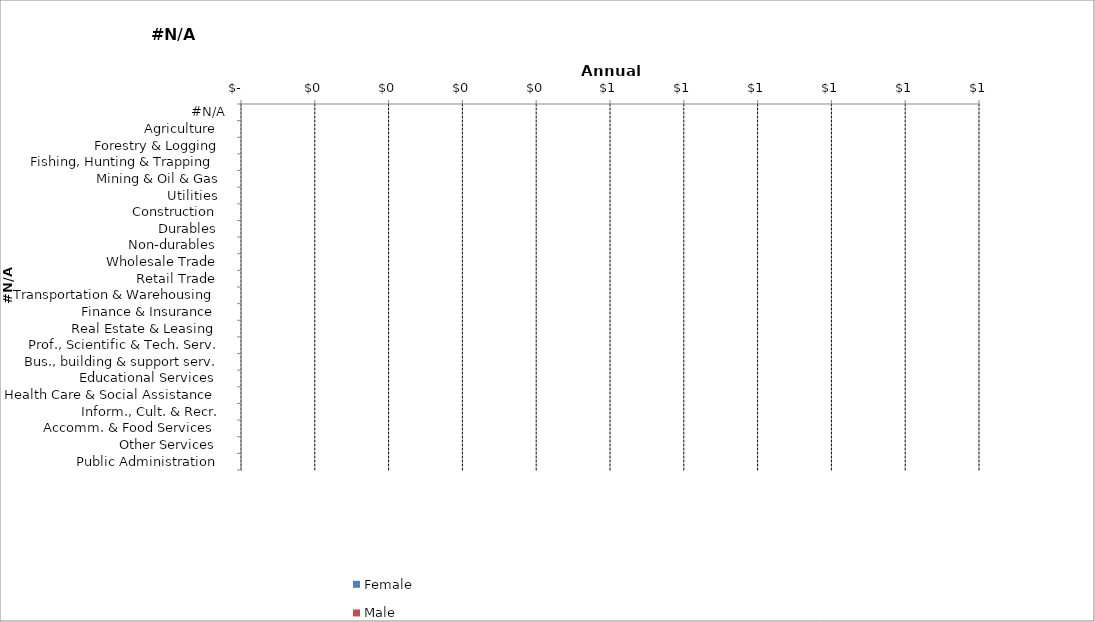
| Category | Female | Male | Ratio |
|---|---|---|---|
|  #N/A  | 0 | 0 | 0 |
|  Agriculture   | 0 | 0 | 0 |
|  Forestry & Logging  | 0 | 0 | 0 |
|  Fishing, Hunting & Trapping   | 0 | 0 | 0 |
|  Mining & Oil & Gas  | 0 | 0 | 0 |
|  Utilities   | 0 | 0 | 0 |
|  Construction   | 0 | 0 | 0 |
|  Durables   | 0 | 0 | 0 |
|  Non-durables   | 0 | 0 | 0 |
|  Wholesale Trade   | 0 | 0 | 0 |
|  Retail Trade   | 0 | 0 | 0 |
|  Transportation & Warehousing   | 0 | 0 | 0 |
|  Finance & Insurance   | 0 | 0 | 0 |
|  Real Estate & Leasing   | 0 | 0 | 0 |
|  Prof., Scientific & Tech. Serv.  | 0 | 0 | 0 |
|  Bus., building & support serv.  | 0 | 0 | 0 |
|  Educational Services   | 0 | 0 | 0 |
|  Health Care & Social Assistance   | 0 | 0 | 0 |
|  Inform., Cult. & Recr.  | 0 | 0 | 0 |
|  Accomm. & Food Services   | 0 | 0 | 0 |
|  Other Services   | 0 | 0 | 0 |
|  Public Administration   | 0 | 0 | 0 |